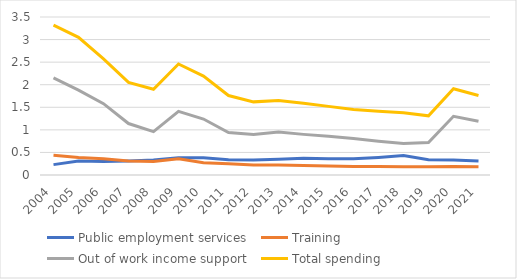
| Category | Public employment services  | Training | Out of work income support | Total spending |
|---|---|---|---|---|
| 2004.0 | 0.23 | 0.44 | 2.15 | 3.32 |
| 2005.0 | 0.31 | 0.39 | 1.88 | 3.05 |
| 2006.0 | 0.3 | 0.36 | 1.58 | 2.57 |
| 2007.0 | 0.31 | 0.31 | 1.14 | 2.05 |
| 2008.0 | 0.33 | 0.3 | 0.96 | 1.9 |
| 2009.0 | 0.38 | 0.36 | 1.41 | 2.46 |
| 2010.0 | 0.38 | 0.27 | 1.24 | 2.19 |
| 2011.0 | 0.34 | 0.25 | 0.94 | 1.76 |
| 2012.0 | 0.33 | 0.22 | 0.9 | 1.62 |
| 2013.0 | 0.35 | 0.22 | 0.95 | 1.65 |
| 2014.0 | 0.37 | 0.21 | 0.9 | 1.59 |
| 2015.0 | 0.36 | 0.2 | 0.86 | 1.52 |
| 2016.0 | 0.36 | 0.19 | 0.81 | 1.45 |
| 2017.0 | 0.39 | 0.19 | 0.75 | 1.41 |
| 2018.0 | 0.43 | 0.18 | 0.7 | 1.38 |
| 2019.0 | 0.34 | 0.18 | 0.72 | 1.31 |
| 2020.0 | 0.33 | 0.19 | 1.3 | 1.91 |
| 2021.0 | 0.31 | 0.18 | 1.19 | 1.76 |